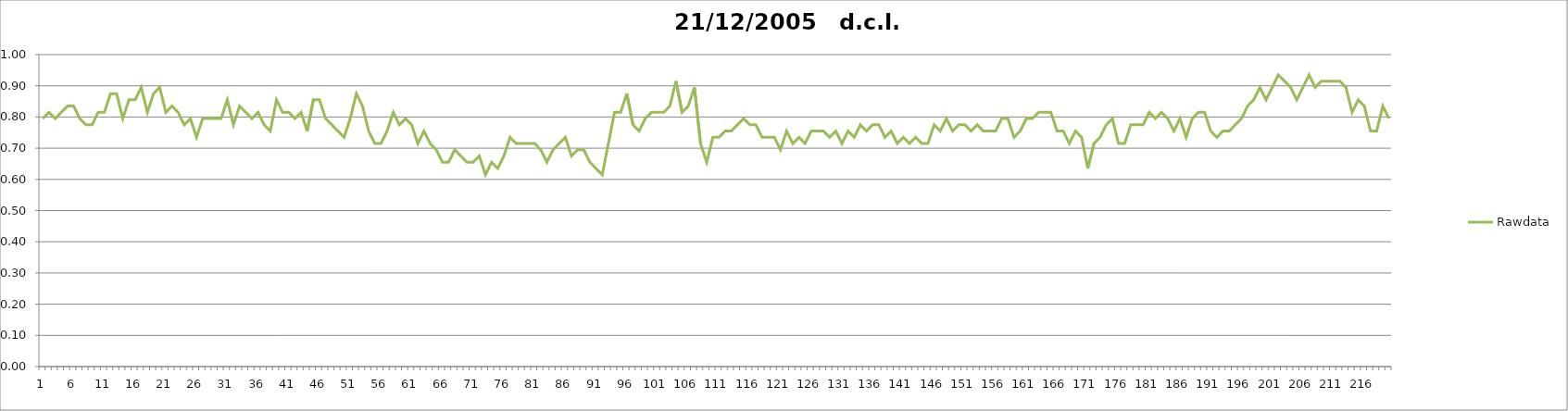
| Category | Rawdata |
|---|---|
| 0 | 0.795 |
| 1 | 0.815 |
| 2 | 0.795 |
| 3 | 0.815 |
| 4 | 0.835 |
| 5 | 0.835 |
| 6 | 0.795 |
| 7 | 0.775 |
| 8 | 0.775 |
| 9 | 0.815 |
| 10 | 0.815 |
| 11 | 0.875 |
| 12 | 0.875 |
| 13 | 0.795 |
| 14 | 0.855 |
| 15 | 0.855 |
| 16 | 0.895 |
| 17 | 0.815 |
| 18 | 0.875 |
| 19 | 0.895 |
| 20 | 0.815 |
| 21 | 0.835 |
| 22 | 0.815 |
| 23 | 0.775 |
| 24 | 0.795 |
| 25 | 0.735 |
| 26 | 0.795 |
| 27 | 0.795 |
| 28 | 0.795 |
| 29 | 0.795 |
| 30 | 0.855 |
| 31 | 0.775 |
| 32 | 0.835 |
| 33 | 0.815 |
| 34 | 0.795 |
| 35 | 0.815 |
| 36 | 0.775 |
| 37 | 0.755 |
| 38 | 0.855 |
| 39 | 0.815 |
| 40 | 0.815 |
| 41 | 0.795 |
| 42 | 0.815 |
| 43 | 0.755 |
| 44 | 0.855 |
| 45 | 0.855 |
| 46 | 0.795 |
| 47 | 0.775 |
| 48 | 0.755 |
| 49 | 0.735 |
| 50 | 0.795 |
| 51 | 0.875 |
| 52 | 0.835 |
| 53 | 0.755 |
| 54 | 0.715 |
| 55 | 0.715 |
| 56 | 0.755 |
| 57 | 0.815 |
| 58 | 0.775 |
| 59 | 0.795 |
| 60 | 0.775 |
| 61 | 0.715 |
| 62 | 0.755 |
| 63 | 0.715 |
| 64 | 0.695 |
| 65 | 0.655 |
| 66 | 0.655 |
| 67 | 0.695 |
| 68 | 0.675 |
| 69 | 0.655 |
| 70 | 0.655 |
| 71 | 0.675 |
| 72 | 0.615 |
| 73 | 0.655 |
| 74 | 0.635 |
| 75 | 0.675 |
| 76 | 0.735 |
| 77 | 0.715 |
| 78 | 0.715 |
| 79 | 0.715 |
| 80 | 0.715 |
| 81 | 0.695 |
| 82 | 0.655 |
| 83 | 0.695 |
| 84 | 0.715 |
| 85 | 0.735 |
| 86 | 0.675 |
| 87 | 0.695 |
| 88 | 0.695 |
| 89 | 0.655 |
| 90 | 0.635 |
| 91 | 0.615 |
| 92 | 0.715 |
| 93 | 0.815 |
| 94 | 0.815 |
| 95 | 0.875 |
| 96 | 0.775 |
| 97 | 0.755 |
| 98 | 0.795 |
| 99 | 0.815 |
| 100 | 0.815 |
| 101 | 0.815 |
| 102 | 0.835 |
| 103 | 0.915 |
| 104 | 0.815 |
| 105 | 0.835 |
| 106 | 0.895 |
| 107 | 0.715 |
| 108 | 0.655 |
| 109 | 0.735 |
| 110 | 0.735 |
| 111 | 0.755 |
| 112 | 0.755 |
| 113 | 0.775 |
| 114 | 0.795 |
| 115 | 0.775 |
| 116 | 0.775 |
| 117 | 0.735 |
| 118 | 0.735 |
| 119 | 0.735 |
| 120 | 0.695 |
| 121 | 0.755 |
| 122 | 0.715 |
| 123 | 0.735 |
| 124 | 0.715 |
| 125 | 0.755 |
| 126 | 0.755 |
| 127 | 0.755 |
| 128 | 0.735 |
| 129 | 0.755 |
| 130 | 0.715 |
| 131 | 0.755 |
| 132 | 0.735 |
| 133 | 0.775 |
| 134 | 0.755 |
| 135 | 0.775 |
| 136 | 0.775 |
| 137 | 0.735 |
| 138 | 0.755 |
| 139 | 0.715 |
| 140 | 0.735 |
| 141 | 0.715 |
| 142 | 0.735 |
| 143 | 0.715 |
| 144 | 0.715 |
| 145 | 0.775 |
| 146 | 0.755 |
| 147 | 0.795 |
| 148 | 0.755 |
| 149 | 0.775 |
| 150 | 0.775 |
| 151 | 0.755 |
| 152 | 0.775 |
| 153 | 0.755 |
| 154 | 0.755 |
| 155 | 0.755 |
| 156 | 0.795 |
| 157 | 0.795 |
| 158 | 0.735 |
| 159 | 0.755 |
| 160 | 0.795 |
| 161 | 0.795 |
| 162 | 0.815 |
| 163 | 0.815 |
| 164 | 0.815 |
| 165 | 0.755 |
| 166 | 0.755 |
| 167 | 0.715 |
| 168 | 0.755 |
| 169 | 0.735 |
| 170 | 0.635 |
| 171 | 0.715 |
| 172 | 0.735 |
| 173 | 0.775 |
| 174 | 0.795 |
| 175 | 0.715 |
| 176 | 0.715 |
| 177 | 0.775 |
| 178 | 0.775 |
| 179 | 0.775 |
| 180 | 0.815 |
| 181 | 0.795 |
| 182 | 0.815 |
| 183 | 0.795 |
| 184 | 0.755 |
| 185 | 0.795 |
| 186 | 0.735 |
| 187 | 0.795 |
| 188 | 0.815 |
| 189 | 0.815 |
| 190 | 0.755 |
| 191 | 0.735 |
| 192 | 0.755 |
| 193 | 0.755 |
| 194 | 0.775 |
| 195 | 0.795 |
| 196 | 0.835 |
| 197 | 0.855 |
| 198 | 0.895 |
| 199 | 0.855 |
| 200 | 0.895 |
| 201 | 0.935 |
| 202 | 0.915 |
| 203 | 0.895 |
| 204 | 0.855 |
| 205 | 0.895 |
| 206 | 0.935 |
| 207 | 0.895 |
| 208 | 0.915 |
| 209 | 0.915 |
| 210 | 0.915 |
| 211 | 0.915 |
| 212 | 0.895 |
| 213 | 0.815 |
| 214 | 0.855 |
| 215 | 0.835 |
| 216 | 0.755 |
| 217 | 0.755 |
| 218 | 0.835 |
| 219 | 0.795 |